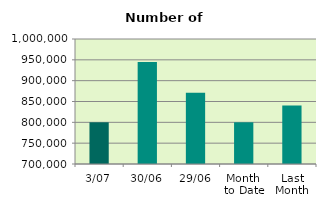
| Category | Series 0 |
|---|---|
| 3/07 | 800080 |
| 30/06 | 944652 |
| 29/06 | 870722 |
| Month 
to Date | 800080 |
| Last
Month | 840506.364 |